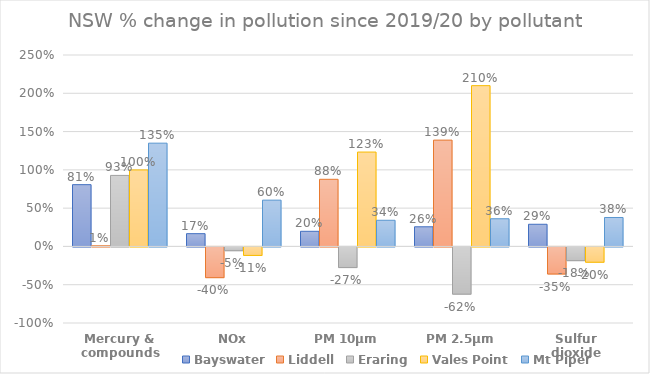
| Category | Bayswater | Liddell |  Eraring  | Vales Point  | Mt Piper |
|---|---|---|---|---|---|
| Mercury & compounds | 0.807 | 0.009 | 0.927 | 0.999 | 1.349 |
| NOx | 0.166 | -0.401 | -0.05 | -0.111 | 0.604 |
| PM 10μm | 0.197 | 0.877 | -0.27 | 1.233 | 0.342 |
| PM 2.5μm | 0.256 | 1.388 | -0.617 | 2.1 | 0.361 |
| Sulfur dioxide | 0.289 | -0.354 | -0.179 | -0.2 | 0.378 |